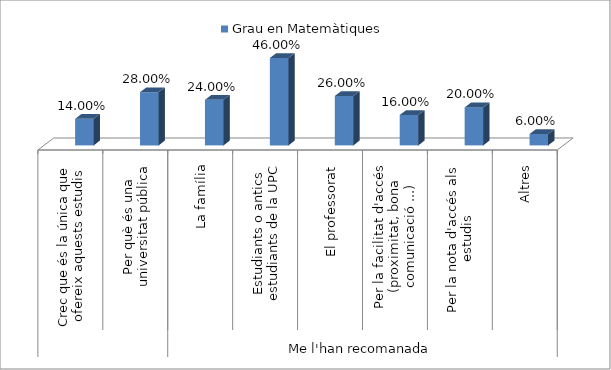
| Category | Series 0 | Grau en Matemàtiques |
|---|---|---|
| 0 |  | 0.14 |
| 1 |  | 0.28 |
| 2 |  | 0.24 |
| 3 |  | 0.46 |
| 4 |  | 0.26 |
| 5 |  | 0.16 |
| 6 |  | 0.2 |
| 7 |  | 0.06 |